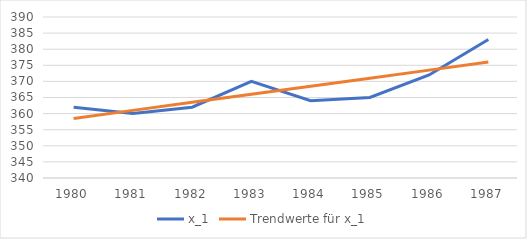
| Category | x_1 | Trendwerte für x_1 |
|---|---|---|
| 1980.0 | 362 | 358.5 |
| 1981.0 | 360 | 361 |
| 1982.0 | 362 | 363.5 |
| 1983.0 | 370 | 366 |
| 1984.0 | 364 | 368.5 |
| 1985.0 | 365 | 371 |
| 1986.0 | 372 | 373.5 |
| 1987.0 | 383 | 376 |